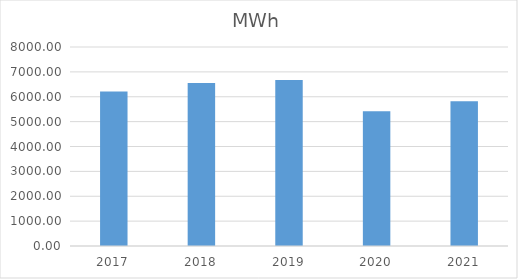
| Category | MWh |
|---|---|
| 2017.0 | 6215.801 |
| 2018.0 | 6555.732 |
| 2019.0 | 6674.743 |
| 2020.0 | 5412.311 |
| 2021.0 | 5818.103 |